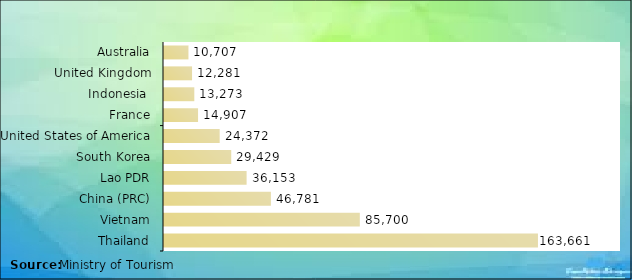
| Category | Series 0 |
|---|---|
| Thailand | 163661 |
| Vietnam | 85700 |
| China (PRC) | 46781 |
| Lao PDR | 36153 |
| South Korea | 29429 |
| United States of America | 24372 |
| France | 14907 |
| Indonesia  | 13273 |
| United Kingdom | 12281 |
| Australia | 10707 |